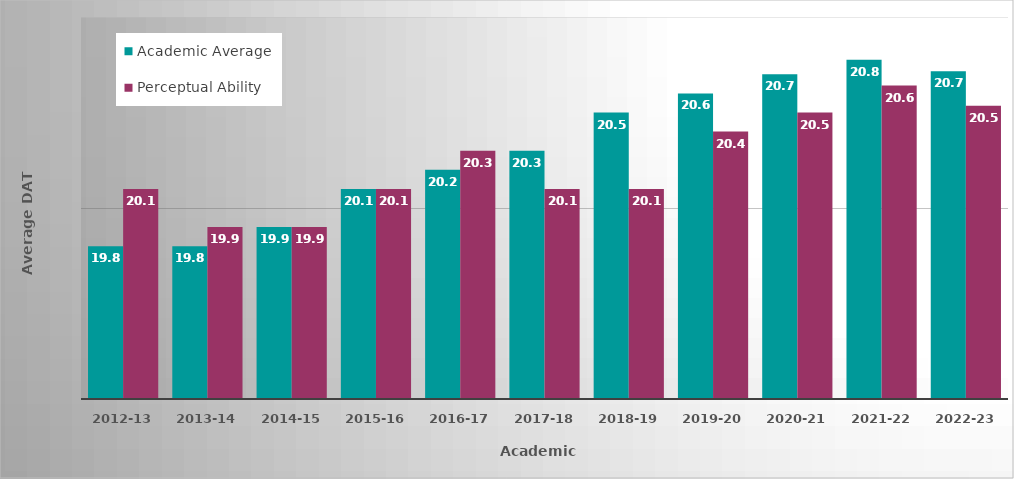
| Category | Academic Average | Perceptual Ability |
|---|---|---|
| 2012-13 | 19.8 | 20.1 |
| 2013-14 | 19.8 | 19.9 |
| 2014-15 | 19.9 | 19.9 |
| 2015-16 | 20.1 | 20.1 |
| 2016-17 | 20.2 | 20.3 |
| 2017-18 | 20.3 | 20.1 |
| 2018-19 | 20.5 | 20.1 |
| 2019-20 | 20.6 | 20.4 |
| 2020-21 | 20.7 | 20.5 |
| 2021-22 | 20.776 | 20.641 |
| 2022-23 | 20.716 | 20.535 |